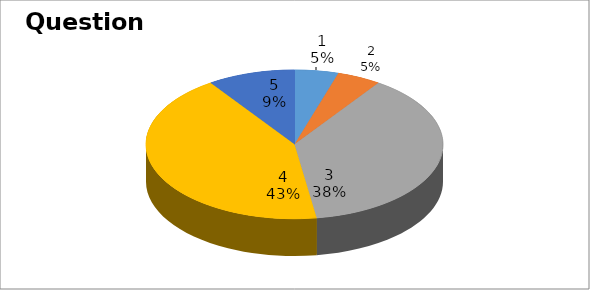
| Category | Series 0 |
|---|---|
| 0 | 1 |
| 1 | 1 |
| 2 | 8 |
| 3 | 9 |
| 4 | 2 |